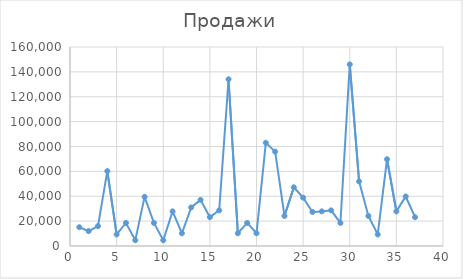
| Category | Продажи |
|---|---|
| 1.0 | 15100 |
| 2.0 | 11967 |
| 3.0 | 16016.25 |
| 4.0 | 60205.1 |
| 5.0 | 9274 |
| 6.0 | 18548 |
| 7.0 | 4637 |
| 8.0 | 39500 |
| 9.0 | 18548 |
| 10.0 | 4637 |
| 11.0 | 27822 |
| 12.0 | 10241 |
| 13.0 | 31041.25 |
| 14.0 | 37096 |
| 15.0 | 23185 |
| 16.0 | 28671 |
| 17.0 | 134057.85 |
| 18.0 | 10241 |
| 19.0 | 18548 |
| 20.0 | 10220 |
| 21.0 | 82960 |
| 22.0 | 75879 |
| 23.0 | 24138 |
| 24.0 | 47208 |
| 25.0 | 38868 |
| 26.0 | 27373 |
| 27.0 | 27822 |
| 28.0 | 28660 |
| 29.0 | 18548 |
| 30.0 | 146019.75 |
| 31.0 | 51965 |
| 32.0 | 24143 |
| 33.0 | 9274 |
| 34.0 | 69761.7 |
| 35.0 | 27822 |
| 36.0 | 39819 |
| 37.0 | 23185 |